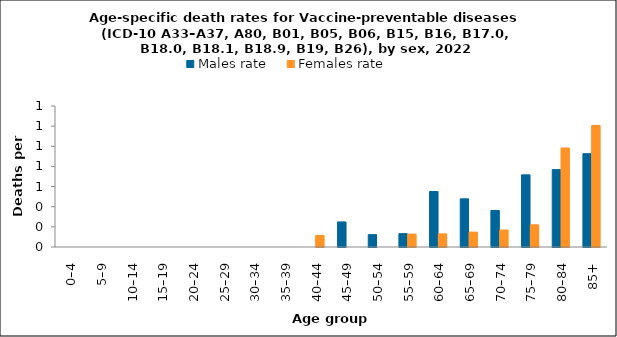
| Category | Males rate | Females rate |
|---|---|---|
| 0–4 | 0 | 0 |
| 5–9 | 0 | 0 |
| 10–14 | 0 | 0 |
| 15–19 | 0 | 0 |
| 20–24 | 0 | 0 |
| 25–29 | 0 | 0 |
| 30–34 | 0 | 0 |
| 35–39 | 0 | 0 |
| 40–44 | 0 | 0.116 |
| 45–49 | 0.249 | 0 |
| 50–54 | 0.123 | 0 |
| 55–59 | 0.133 | 0.128 |
| 60–64 | 0.551 | 0.13 |
| 65–69 | 0.478 | 0.148 |
| 70–74 | 0.363 | 0.168 |
| 75–79 | 0.717 | 0.22 |
| 80–84 | 0.768 | 0.983 |
| 85+ | 0.927 | 1.207 |